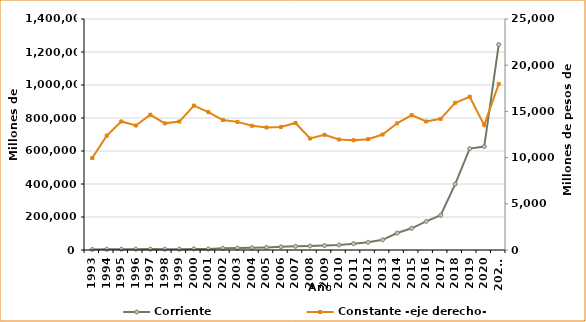
| Category | Corriente |
|---|---|
| 1993 | 3594874713.659 |
| 1994 | 4297033702.615 |
| 1995 | 4868585384.052 |
| 1996 | 5143748708.616 |
| 1997 | 5327016570.595 |
| 1998 | 4742961439.427 |
| 1999 | 5089381624.853 |
| 2000 | 6663535690.649 |
| 2001 | 6063891677.842 |
| 2002 | 10621514438.549 |
| 2003 | 11399935375.826 |
| 2004 | 13442824244.413 |
| 2005 | 15872178429.185 |
| 2006 | 19153937659.05 |
| 2007 | 22486401442.838 |
| 2008 | 24413501451.993 |
| 2009 | 27033700139.568 |
| 2010 | 30492339054.734 |
| 2011 | 38573230297.417 |
| 2012 | 46468701516.609 |
| 2013 | 61599948797.379 |
| 2014 | 102795301128.576 |
| 2015 | 131595541214.165 |
| 2016 | 173294131010.723 |
| 2017 | 210499998894.522 |
| 2018 | 399593076190.699 |
| 2019 | 614417722151.487 |
| 2020 | 626682280452.852 |
| 2021* | 1244874633187.938 |